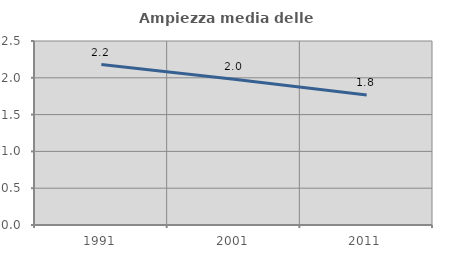
| Category | Ampiezza media delle famiglie |
|---|---|
| 1991.0 | 2.179 |
| 2001.0 | 1.981 |
| 2011.0 | 1.766 |